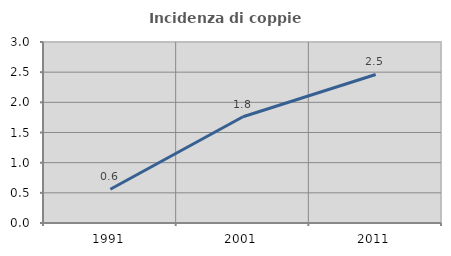
| Category | Incidenza di coppie miste |
|---|---|
| 1991.0 | 0.559 |
| 2001.0 | 1.761 |
| 2011.0 | 2.462 |